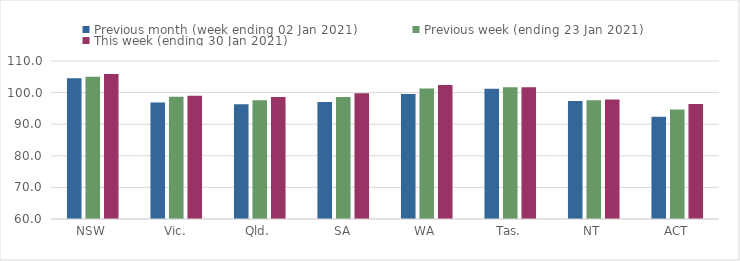
| Category | Previous month (week ending 02 Jan 2021) | Previous week (ending 23 Jan 2021) | This week (ending 30 Jan 2021) |
|---|---|---|---|
| NSW | 104.55 | 105.05 | 105.9 |
| Vic. | 96.86 | 98.72 | 99.02 |
| Qld. | 96.3 | 97.58 | 98.58 |
| SA | 97 | 98.63 | 99.83 |
| WA | 99.52 | 101.32 | 102.44 |
| Tas. | 101.24 | 101.71 | 101.71 |
| NT | 97.31 | 97.59 | 97.82 |
| ACT | 92.36 | 94.69 | 96.39 |